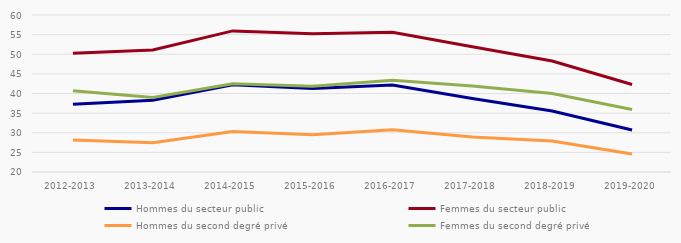
| Category | Hommes du secteur public | Femmes du secteur public | Hommes du second degré privé | Femmes du second degré privé |
|---|---|---|---|---|
| 2012-2013 | 37.28 | 50.24 | 28.18 | 40.68 |
| 2013-2014 | 38.27 | 51.11 | 27.45 | 38.98 |
| 2014-2015 | 42.24 | 55.95 | 30.34 | 42.47 |
| 2015-2016 | 41.27 | 55.24 | 29.5 | 41.87 |
| 2016-2017 | 42.15 | 55.62 | 30.74 | 43.35 |
| 2017-2018 | 38.72 | 51.91 | 28.94 | 41.9 |
| 2018-2019 | 35.53 | 48.27 | 27.9 | 40.01 |
| 2019-2020 | 30.68 | 42.28 | 24.6 | 35.91 |